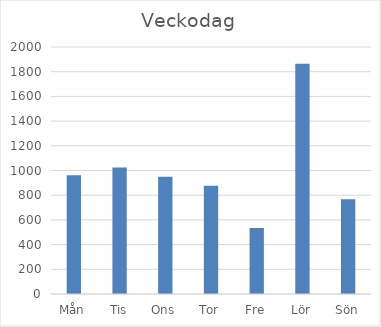
| Category | Summa |
|---|---|
| Mån | 961 |
| Tis | 1025 |
| Ons | 949 |
| Tor | 877 |
| Fre | 535 |
| Lör | 1865 |
| Sön | 768 |